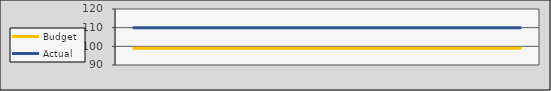
| Category | Budget | Actual |
|---|---|---|
| 2020-07-01 | 99 | 110 |
| 2020-08-01 | 99 | 110 |
| 2020-09-01 | 99 | 110 |
| 2020-10-02 | 99 | 110 |
| 2020-11-02 | 99 | 110 |
| 2020-12-03 | 99 | 110 |
| 2021-01-03 | 99 | 110 |
| 2021-02-03 | 99 | 110 |
| 2021-03-06 | 99 | 110 |
| 2021-04-06 | 99 | 110 |
| 2021-05-07 | 99 | 110 |
| 2021-06-07 | 99 | 110 |